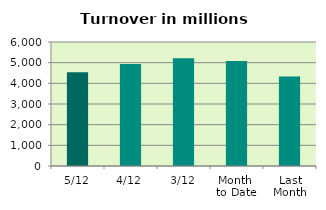
| Category | Series 0 |
|---|---|
| 5/12 | 4541.682 |
| 4/12 | 4930.059 |
| 3/12 | 5218.606 |
| Month 
to Date | 5082.03 |
| Last
Month | 4332.538 |